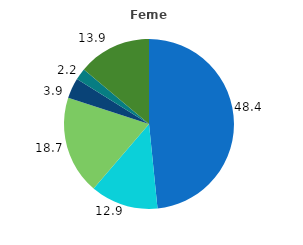
| Category | Series 0 |
|---|---|
| 0 | 48.4 |
| 1 | 12.9 |
| 2 | 18.7 |
| 3 | 3.9 |
| 4 | 2.2 |
| 5 | 13.9 |